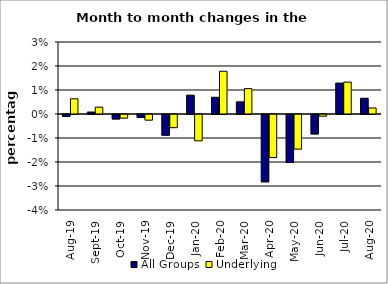
| Category | All Groups | Underlying |
|---|---|---|
| 2019-08-01 | -0.001 | 0.006 |
| 2019-09-01 | 0.001 | 0.003 |
| 2019-10-01 | -0.002 | -0.002 |
| 2019-11-01 | -0.001 | -0.002 |
| 2019-12-01 | -0.009 | -0.005 |
| 2020-01-01 | 0.008 | -0.011 |
| 2020-02-01 | 0.007 | 0.018 |
| 2020-03-01 | 0.005 | 0.011 |
| 2020-04-01 | -0.028 | -0.018 |
| 2020-05-01 | -0.02 | -0.014 |
| 2020-06-01 | -0.008 | -0.001 |
| 2020-07-01 | 0.013 | 0.013 |
| 2020-08-01 | 0.007 | 0.003 |